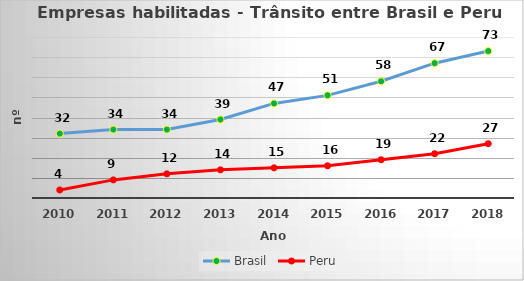
| Category | Brasil | Peru |
|---|---|---|
| 2010.0 | 32 | 4 |
| 2011.0 | 34 | 9 |
| 2012.0 | 34 | 12 |
| 2013.0 | 39 | 14 |
| 2014.0 | 47 | 15 |
| 2015.0 | 51 | 16 |
| 2016.0 | 58 | 19 |
| 2017.0 | 67 | 22 |
| 2018.0 | 73 | 27 |